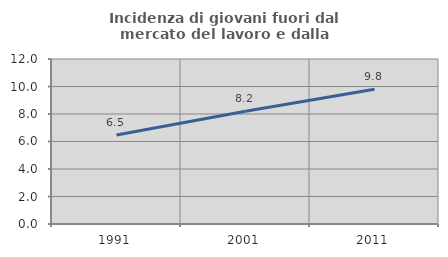
| Category | Incidenza di giovani fuori dal mercato del lavoro e dalla formazione  |
|---|---|
| 1991.0 | 6.476 |
| 2001.0 | 8.2 |
| 2011.0 | 9.796 |